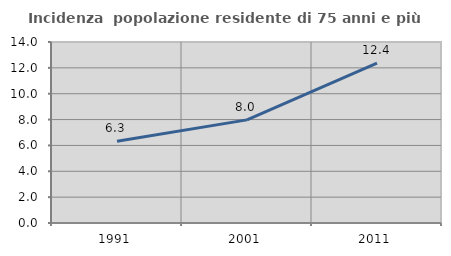
| Category | Incidenza  popolazione residente di 75 anni e più |
|---|---|
| 1991.0 | 6.325 |
| 2001.0 | 7.977 |
| 2011.0 | 12.374 |